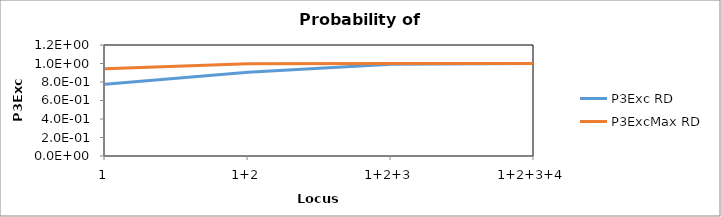
| Category | P3Exc RD | P3ExcMax RD |
|---|---|---|
| 1 | 0.776 | 0.943 |
| 1+2 | 0.906 | 0.997 |
| 1+2+3 | 0.992 | 1 |
| 1+2+3+4 | 0.999 | 1 |